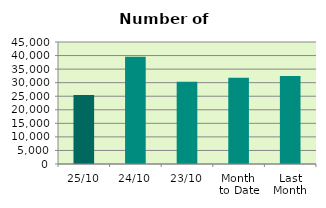
| Category | Series 0 |
|---|---|
| 25/10 | 25430 |
| 24/10 | 39520 |
| 23/10 | 30342 |
| Month 
to Date | 31797.684 |
| Last
Month | 32492.381 |